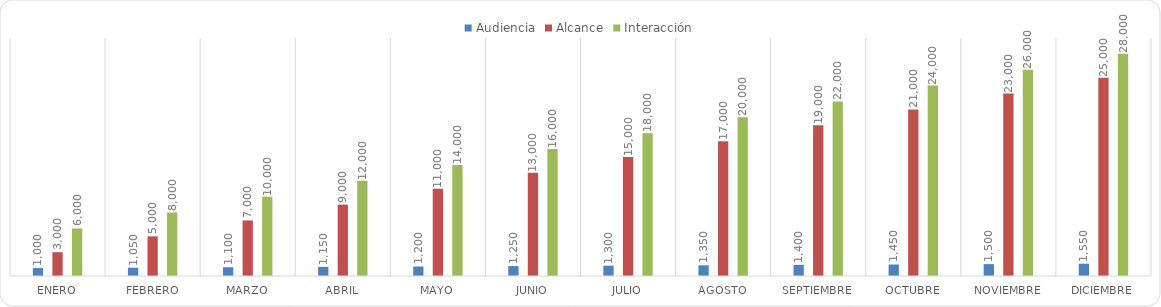
| Category | Audiencia | Alcance | Interacción |
|---|---|---|---|
| Enero | 1000 | 3000 | 6000 |
| Febrero | 1050 | 5000 | 8000 |
| Marzo | 1100 | 7000 | 10000 |
| Abril | 1150 | 9000 | 12000 |
| Mayo | 1200 | 11000 | 14000 |
| Junio | 1250 | 13000 | 16000 |
| Julio | 1300 | 15000 | 18000 |
| Agosto | 1350 | 17000 | 20000 |
| Septiembre | 1400 | 19000 | 22000 |
| Octubre | 1450 | 21000 | 24000 |
| Noviembre | 1500 | 23000 | 26000 |
| Diciembre | 1550 | 25000 | 28000 |